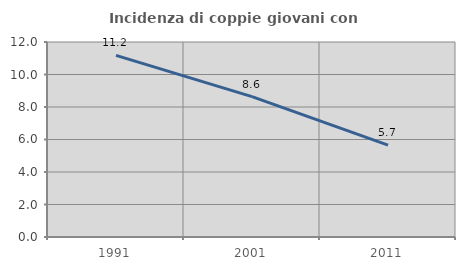
| Category | Incidenza di coppie giovani con figli |
|---|---|
| 1991.0 | 11.176 |
| 2001.0 | 8.64 |
| 2011.0 | 5.657 |